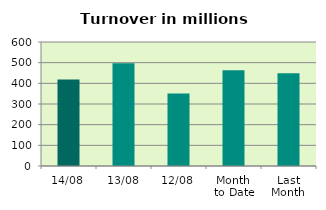
| Category | Series 0 |
|---|---|
| 14/08 | 418.723 |
| 13/08 | 497.651 |
| 12/08 | 350.259 |
| Month 
to Date | 463.831 |
| Last
Month | 448.907 |